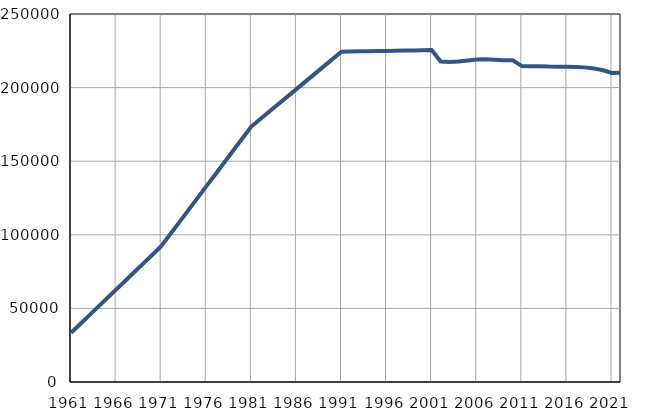
| Category | Population
size |
|---|---|
| 1961.0 | 33347 |
| 1962.0 | 39232 |
| 1963.0 | 45118 |
| 1964.0 | 51003 |
| 1965.0 | 56888 |
| 1966.0 | 62773 |
| 1967.0 | 68659 |
| 1968.0 | 74544 |
| 1969.0 | 80429 |
| 1970.0 | 86315 |
| 1971.0 | 92200 |
| 1972.0 | 100334 |
| 1973.0 | 108468 |
| 1974.0 | 116602 |
| 1975.0 | 124736 |
| 1976.0 | 132871 |
| 1977.0 | 141005 |
| 1978.0 | 149138 |
| 1979.0 | 157273 |
| 1980.0 | 165407 |
| 1981.0 | 173541 |
| 1982.0 | 178629 |
| 1983.0 | 183718 |
| 1984.0 | 188806 |
| 1985.0 | 193894 |
| 1986.0 | 198983 |
| 1987.0 | 204071 |
| 1988.0 | 209159 |
| 1989.0 | 214247 |
| 1990.0 | 219336 |
| 1991.0 | 224424 |
| 1992.0 | 224529 |
| 1993.0 | 224633 |
| 1994.0 | 224738 |
| 1995.0 | 224843 |
| 1996.0 | 224947 |
| 1997.0 | 225052 |
| 1998.0 | 225156 |
| 1999.0 | 225261 |
| 2000.0 | 225366 |
| 2001.0 | 225470 |
| 2002.0 | 217706 |
| 2003.0 | 217361 |
| 2004.0 | 217706 |
| 2005.0 | 218439 |
| 2006.0 | 219012 |
| 2007.0 | 219208 |
| 2008.0 | 218977 |
| 2009.0 | 218593 |
| 2010.0 | 218504 |
| 2011.0 | 214587 |
| 2012.0 | 214466 |
| 2013.0 | 214512 |
| 2014.0 | 214277 |
| 2015.0 | 214229 |
| 2016.0 | 214132 |
| 2017.0 | 213985 |
| 2018.0 | 213742 |
| 2019.0 | 213040 |
| 2020.0 | 211788 |
| 2021.0 | 209941 |
| 2022.0 | 210191 |